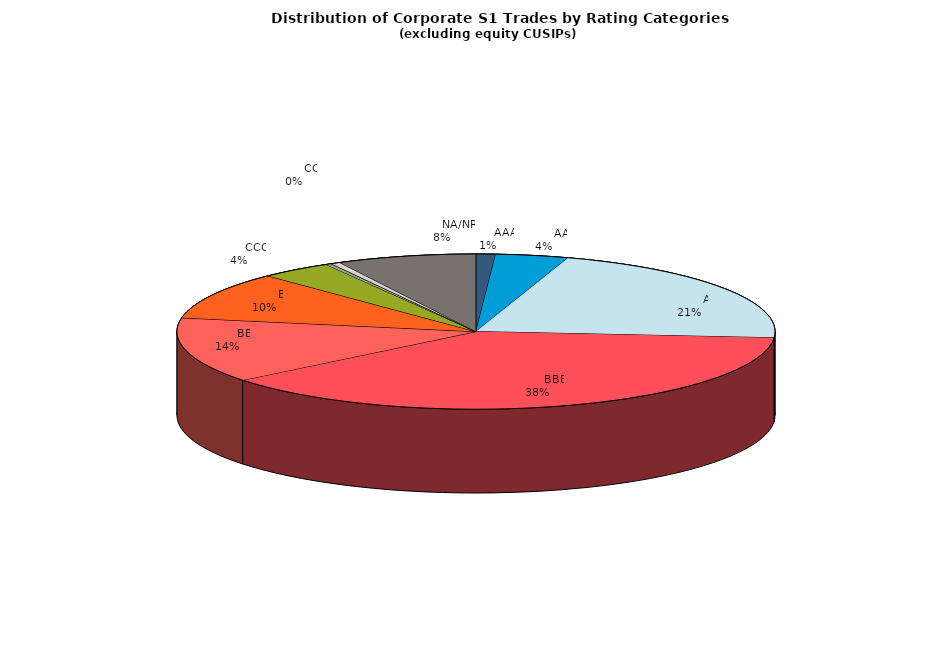
| Category | Series 0 |
|---|---|
|         AAA | 594.988 |
|         AA | 2229.721 |
|         A | 12042.072 |
|         BBB | 21481.004 |
|         BB | 7691.789 |
|         B | 5606.466 |
|         CCC | 2200.295 |
|         CC | 171.713 |
|         C | 23.554 |
|         D | 271.964 |
|         NA/NR | 4261.873 |